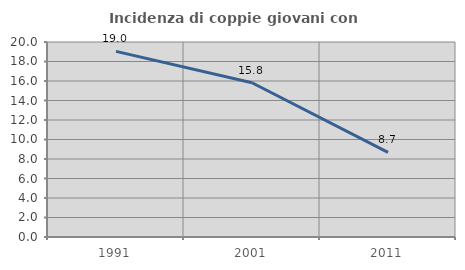
| Category | Incidenza di coppie giovani con figli |
|---|---|
| 1991.0 | 19.038 |
| 2001.0 | 15.818 |
| 2011.0 | 8.686 |